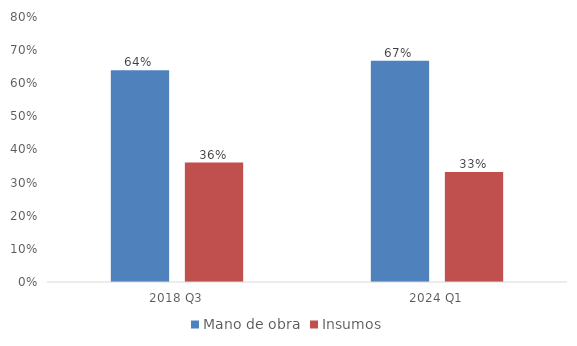
| Category | Mano de obra | Insumos |
|---|---|---|
| 2018 Q3 | 0.639 | 0.361 |
| 2024 Q1 | 0.668 | 0.332 |